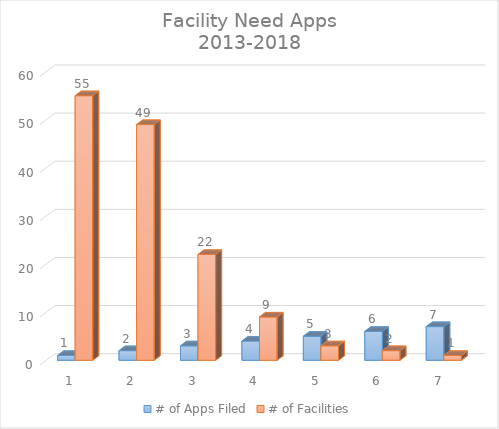
| Category | # of Apps Filed | # of Facilities |
|---|---|---|
| 0 | 1 | 55 |
| 1 | 2 | 49 |
| 2 | 3 | 22 |
| 3 | 4 | 9 |
| 4 | 5 | 3 |
| 5 | 6 | 2 |
| 6 | 7 | 1 |